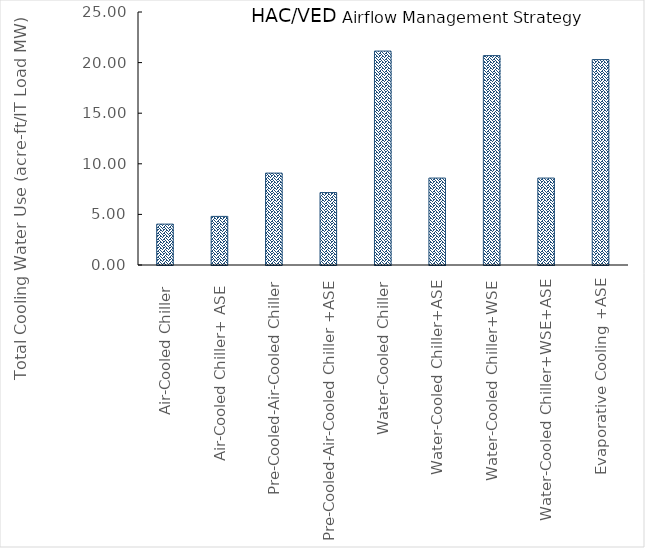
| Category | Series 0 |
|---|---|
| Air-Cooled Chiller  | 4.04 |
| Air-Cooled Chiller+ ASE  | 4.803 |
| Pre-Cooled-Air-Cooled Chiller | 9.081 |
| Pre-Cooled-Air-Cooled Chiller +ASE | 7.157 |
| Water-Cooled Chiller | 21.14 |
| Water-Cooled Chiller+ASE | 8.59 |
| Water-Cooled Chiller+WSE | 20.69 |
| Water-Cooled Chiller+WSE+ASE | 8.59 |
| Evaporative Cooling +ASE | 20.299 |